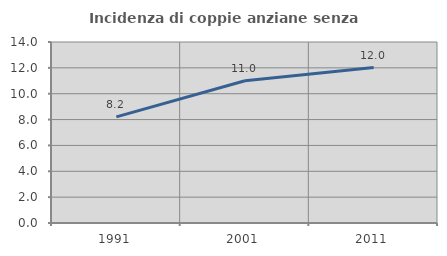
| Category | Incidenza di coppie anziane senza figli  |
|---|---|
| 1991.0 | 8.21 |
| 2001.0 | 11.003 |
| 2011.0 | 12.023 |